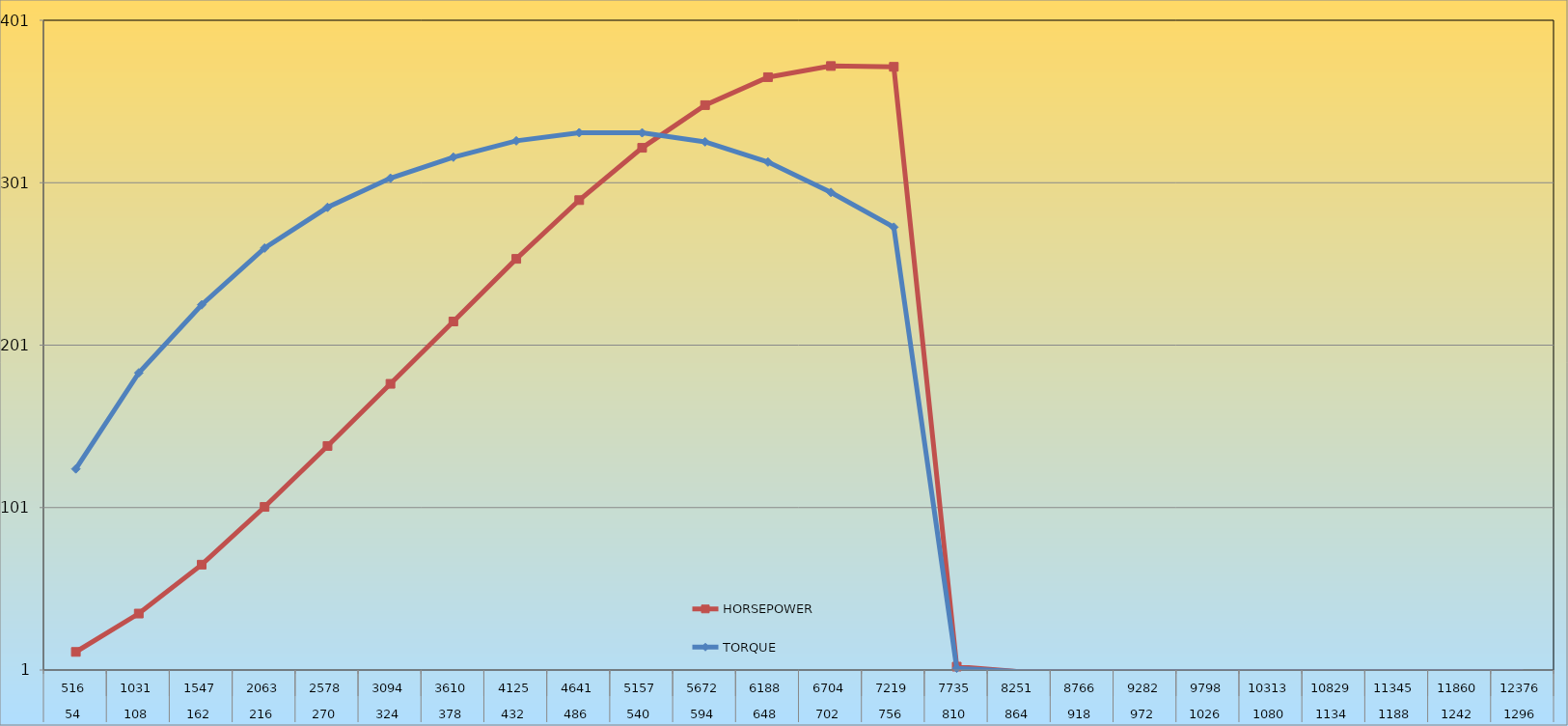
| Category | HORSEPOWER | TORQUE |
|---|---|---|
| 0 | 12.142 | 124.826 |
| 1 | 35.748 | 183.922 |
| 2 | 65.861 | 225.831 |
| 3 | 101.414 | 260.762 |
| 4 | 138.91 | 285.823 |
| 5 | 177.183 | 303.772 |
| 6 | 215.553 | 316.733 |
| 7 | 254.115 | 326.778 |
| 8 | 290.281 | 331.782 |
| 9 | 322.495 | 331.72 |
| 10 | 348.758 | 326.163 |
| 11 | 365.967 | 313.716 |
| 12 | 372.85 | 295.016 |
| 13 | 372.353 | 273.605 |
| 14 | 3.074 | 2.108 |
| 15 | 0 | 0 |
| 16 | 0 | 0 |
| 17 | 0 | 0 |
| 18 | 0 | 0 |
| 19 | 0 | 0 |
| 20 | 0 | 0 |
| 21 | 0 | 0 |
| 22 | 0 | 0 |
| 23 | 0 | 0 |